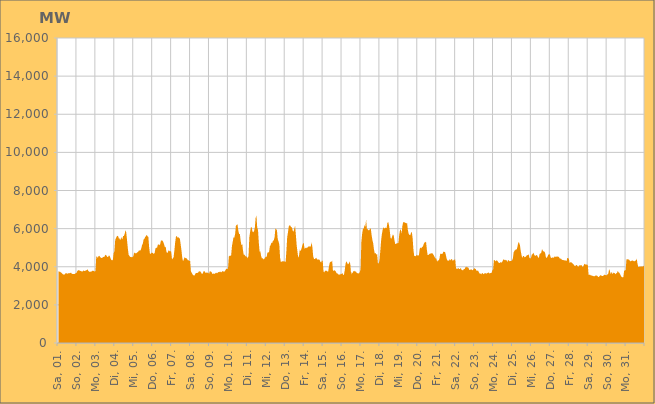
| Category | Series 0 |
|---|---|
|  Sa, 01.  | 3782.002 |
|  Sa, 01.  | 3737.937 |
|  Sa, 01.  | 3747.862 |
|  Sa, 01.  | 3707.015 |
|  Sa, 01.  | 3675.339 |
|  Sa, 01.  | 3641 |
|  Sa, 01.  | 3598.636 |
|  Sa, 01.  | 3596.49 |
|  Sa, 01.  | 3598.095 |
|  Sa, 01.  | 3652.015 |
|  Sa, 01.  | 3672.705 |
|  Sa, 01.  | 3621.643 |
|  Sa, 01.  | 3664.609 |
|  Sa, 01.  | 3659.359 |
|  Sa, 01.  | 3661.514 |
|  Sa, 01.  | 3672.214 |
|  Sa, 01.  | 3689.21 |
|  So, 02.  | 3633.749 |
|  So, 02.  | 3615.38 |
|  So, 02.  | 3622.406 |
|  So, 02.  | 3617.272 |
|  So, 02.  | 3628.931 |
|  So, 02.  | 3666.061 |
|  So, 02.  | 3671.611 |
|  So, 02.  | 3781.174 |
|  So, 02.  | 3814.514 |
|  So, 02.  | 3818.328 |
|  So, 02.  | 3800.51 |
|  So, 02.  | 3779.89 |
|  So, 02.  | 3763.114 |
|  So, 02.  | 3752.59 |
|  So, 02.  | 3763.972 |
|  So, 02.  | 3812.8 |
|  So, 02.  | 3767.855 |
|  So, 02.  | 3792.08 |
|  So, 02.  | 3807.779 |
|  So, 02.  | 3821.758 |
|  So, 02.  | 3868.054 |
|  So, 02.  | 3775.255 |
|  So, 02.  | 3751.963 |
|  So, 02.  | 3718.9 |
|  Mo, 03.  | 3756.618 |
|  Mo, 03.  | 3752.046 |
|  Mo, 03.  | 3786.243 |
|  Mo, 03.  | 3795.351 |
|  Mo, 03.  | 3771.194 |
|  Mo, 03.  | 3748.571 |
|  Mo, 03.  | 3783.521 |
|  Mo, 03.  | 4536.566 |
|  Mo, 03.  | 4526.029 |
|  Mo, 03.  | 4464.249 |
|  Mo, 03.  | 4565.328 |
|  Mo, 03.  | 4572.466 |
|  Mo, 03.  | 4505.5 |
|  Mo, 03.  | 4469.048 |
|  Mo, 03.  | 4453.125 |
|  Mo, 03.  | 4485.286 |
|  Mo, 03.  | 4524.361 |
|  Mo, 03.  | 4504.729 |
|  Mo, 03.  | 4586.432 |
|  Mo, 03.  | 4631.263 |
|  Mo, 03.  | 4581.992 |
|  Mo, 03.  | 4516.867 |
|  Mo, 03.  | 4516.41 |
|  Mo, 03.  | 4585.917 |
|  Di, 04.  | 4573.185 |
|  Di, 04.  | 4452.407 |
|  Di, 04.  | 4360.591 |
|  Di, 04.  | 4332.591 |
|  Di, 04.  | 4357.516 |
|  Di, 04.  | 4705.307 |
|  Di, 04.  | 4811.66 |
|  Di, 04.  | 5400.556 |
|  Di, 04.  | 5505.17 |
|  Di, 04.  | 5593.89 |
|  Di, 04.  | 5627.192 |
|  Di, 04.  | 5574.746 |
|  Di, 04.  | 5430.741 |
|  Di, 04.  | 5517.696 |
|  Di, 04.  | 5394.053 |
|  Di, 04.  | 5569.911 |
|  Di, 04.  | 5418.776 |
|  Di, 04.  | 5608.878 |
|  Di, 04.  | 5618.066 |
|  Di, 04.  | 5717.975 |
|  Di, 04.  | 5915.155 |
|  Di, 04.  | 5804.004 |
|  Di, 04.  | 5392.953 |
|  Di, 04.  | 4965.932 |
|  Mi, 05.  | 4627.926 |
|  Mi, 05.  | 4579.606 |
|  Mi, 05.  | 4498.724 |
|  Mi, 05.  | 4529.513 |
|  Mi, 05.  | 4492.445 |
|  Mi, 05.  | 4512.98 |
|  Mi, 05.  | 4554.381 |
|  Mi, 05.  | 4743.717 |
|  Mi, 05.  | 4711.019 |
|  Mi, 05.  | 4707.628 |
|  Mi, 05.  | 4708.21 |
|  Mi, 05.  | 4757.462 |
|  Mi, 05.  | 4778.803 |
|  Mi, 05.  | 4849.703 |
|  Mi, 05.  | 4853.038 |
|  Mi, 05.  | 4857.728 |
|  Mi, 05.  | 4955.215 |
|  Mi, 05.  | 5129.652 |
|  Mi, 05.  | 5219.118 |
|  Mi, 05.  | 5430.209 |
|  Mi, 05.  | 5468.647 |
|  Mi, 05.  | 5561.348 |
|  Mi, 05.  | 5606.072 |
|  Mi, 05.  | 5678.895 |
|  Do, 06.  | 5591.899 |
|  Do, 06.  | 5571.277 |
|  Do, 06.  | 5035.214 |
|  Do, 06.  | 4689.11 |
|  Do, 06.  | 4686.462 |
|  Do, 06.  | 4738.549 |
|  Do, 06.  | 4733.354 |
|  Do, 06.  | 4711.485 |
|  Do, 06.  | 4671.442 |
|  Do, 06.  | 4726.99 |
|  Do, 06.  | 4963.716 |
|  Do, 06.  | 4996.677 |
|  Do, 06.  | 4990.269 |
|  Do, 06.  | 5148.677 |
|  Do, 06.  | 5175.778 |
|  Do, 06.  | 5133.891 |
|  Do, 06.  | 5180.656 |
|  Do, 06.  | 5385.416 |
|  Do, 06.  | 5373.939 |
|  Do, 06.  | 5367.901 |
|  Do, 06.  | 5295.567 |
|  Do, 06.  | 5166.72 |
|  Do, 06.  | 5032.67 |
|  Do, 06.  | 5047.381 |
|  Fr, 07.  | 4773.019 |
|  Fr, 07.  | 4712.063 |
|  Fr, 07.  | 4790.84 |
|  Fr, 07.  | 4870.715 |
|  Fr, 07.  | 4806.021 |
|  Fr, 07.  | 4824.302 |
|  Fr, 07.  | 4776.832 |
|  Fr, 07.  | 4384.258 |
|  Fr, 07.  | 4440.236 |
|  Fr, 07.  | 4493.506 |
|  Fr, 07.  | 4851.806 |
|  Fr, 07.  | 5270.431 |
|  Fr, 07.  | 5573.264 |
|  Fr, 07.  | 5620.718 |
|  Fr, 07.  | 5523.539 |
|  Fr, 07.  | 5553.817 |
|  Fr, 07.  | 5504.785 |
|  Fr, 07.  | 5471.97 |
|  Fr, 07.  | 5170.54 |
|  Fr, 07.  | 4859.053 |
|  Fr, 07.  | 4465.393 |
|  Fr, 07.  | 4290.003 |
|  Fr, 07.  | 4393.885 |
|  Fr, 07.  | 4502.364 |
|  Sa, 08.  | 4453.157 |
|  Sa, 08.  | 4450.577 |
|  Sa, 08.  | 4426.308 |
|  Sa, 08.  | 4344.243 |
|  Sa, 08.  | 4346.778 |
|  Sa, 08.  | 4306.241 |
|  Sa, 08.  | 4302.773 |
|  Sa, 08.  | 3745.438 |
|  Sa, 08.  | 3685.118 |
|  Sa, 08.  | 3597.875 |
|  Sa, 08.  | 3563.397 |
|  Sa, 08.  | 3525.364 |
|  Sa, 08.  | 3577.997 |
|  Sa, 08.  | 3657.624 |
|  Sa, 08.  | 3678.878 |
|  Sa, 08.  | 3674.114 |
|  Sa, 08.  | 3689.371 |
|  Sa, 08.  | 3747.44 |
|  Sa, 08.  | 3761.906 |
|  Sa, 08.  | 3744.677 |
|  Sa, 08.  | 3695.959 |
|  Sa, 08.  | 3609.359 |
|  Sa, 08.  | 3657.762 |
|  Sa, 08.  | 3762.525 |
|  So, 09.  | 3782.242 |
|  So, 09.  | 3704.077 |
|  So, 09.  | 3674.979 |
|  So, 09.  | 3697.031 |
|  So, 09.  | 3686.918 |
|  So, 09.  | 3683.702 |
|  So, 09.  | 3623.076 |
|  So, 09.  | 3776.44 |
|  So, 09.  | 3747.538 |
|  So, 09.  | 3728.238 |
|  So, 09.  | 3638.538 |
|  So, 09.  | 3617.501 |
|  So, 09.  | 3658.413 |
|  So, 09.  | 3615.746 |
|  So, 09.  | 3659.238 |
|  So, 09.  | 3691.62 |
|  So, 09.  | 3649.033 |
|  So, 09.  | 3697.066 |
|  So, 09.  | 3719.458 |
|  So, 09.  | 3716.969 |
|  So, 09.  | 3756.187 |
|  So, 09.  | 3709.144 |
|  So, 09.  | 3722.371 |
|  So, 09.  | 3774.507 |
|  Mo, 10.  | 3756.208 |
|  Mo, 10.  | 3735.423 |
|  Mo, 10.  | 3767.448 |
|  Mo, 10.  | 3843.861 |
|  Mo, 10.  | 3899.959 |
|  Mo, 10.  | 3884.961 |
|  Mo, 10.  | 3895.92 |
|  Mo, 10.  | 4530.569 |
|  Mo, 10.  | 4581.591 |
|  Mo, 10.  | 4571.974 |
|  Mo, 10.  | 4609.064 |
|  Mo, 10.  | 5094.474 |
|  Mo, 10.  | 5321.23 |
|  Mo, 10.  | 5554.166 |
|  Mo, 10.  | 5520.664 |
|  Mo, 10.  | 5728.416 |
|  Mo, 10.  | 6151.398 |
|  Mo, 10.  | 6191.912 |
|  Mo, 10.  | 6230.986 |
|  Mo, 10.  | 5905.755 |
|  Mo, 10.  | 5725.145 |
|  Mo, 10.  | 5712.182 |
|  Mo, 10.  | 5363.663 |
|  Mo, 10.  | 5125.811 |
|  Di, 11.  | 5206.798 |
|  Di, 11.  | 4840.213 |
|  Di, 11.  | 4620.516 |
|  Di, 11.  | 4630.933 |
|  Di, 11.  | 4557.37 |
|  Di, 11.  | 4521.27 |
|  Di, 11.  | 4539.363 |
|  Di, 11.  | 4435.715 |
|  Di, 11.  | 4583.82 |
|  Di, 11.  | 5534.581 |
|  Di, 11.  | 5834.461 |
|  Di, 11.  | 6064.9 |
|  Di, 11.  | 6073.823 |
|  Di, 11.  | 5843.797 |
|  Di, 11.  | 5809.963 |
|  Di, 11.  | 5878.3 |
|  Di, 11.  | 6051.386 |
|  Di, 11.  | 6559.709 |
|  Di, 11.  | 6686.046 |
|  Di, 11.  | 6055.619 |
|  Di, 11.  | 5939.889 |
|  Di, 11.  | 5273.543 |
|  Di, 11.  | 4798.165 |
|  Di, 11.  | 4807.233 |
|  Mi, 12.  | 4550.74 |
|  Mi, 12.  | 4439.635 |
|  Mi, 12.  | 4442.729 |
|  Mi, 12.  | 4384.568 |
|  Mi, 12.  | 4416.689 |
|  Mi, 12.  | 4490.583 |
|  Mi, 12.  | 4524.045 |
|  Mi, 12.  | 4524.139 |
|  Mi, 12.  | 4749.835 |
|  Mi, 12.  | 4748.935 |
|  Mi, 12.  | 4774.115 |
|  Mi, 12.  | 5069.244 |
|  Mi, 12.  | 5135.284 |
|  Mi, 12.  | 5265.431 |
|  Mi, 12.  | 5241.344 |
|  Mi, 12.  | 5363.464 |
|  Mi, 12.  | 5383.742 |
|  Mi, 12.  | 5542.879 |
|  Mi, 12.  | 6001.75 |
|  Mi, 12.  | 5975.249 |
|  Mi, 12.  | 5915.383 |
|  Mi, 12.  | 5448.655 |
|  Mi, 12.  | 5329.567 |
|  Mi, 12.  | 5161.801 |
|  Do, 13.  | 4471.377 |
|  Do, 13.  | 4244.974 |
|  Do, 13.  | 4273.962 |
|  Do, 13.  | 4284.32 |
|  Do, 13.  | 4295.82 |
|  Do, 13.  | 4267.213 |
|  Do, 13.  | 4284.693 |
|  Do, 13.  | 4250.313 |
|  Do, 13.  | 4830.858 |
|  Do, 13.  | 5559.259 |
|  Do, 13.  | 5807.819 |
|  Do, 13.  | 6120.847 |
|  Do, 13.  | 6175.66 |
|  Do, 13.  | 6156.869 |
|  Do, 13.  | 6077.879 |
|  Do, 13.  | 6061.495 |
|  Do, 13.  | 5889.787 |
|  Do, 13.  | 5843.228 |
|  Do, 13.  | 6003.171 |
|  Do, 13.  | 6148.768 |
|  Do, 13.  | 5668.821 |
|  Do, 13.  | 5135.559 |
|  Do, 13.  | 4789.068 |
|  Do, 13.  | 4462.977 |
|  Fr, 14.  | 4591.733 |
|  Fr, 14.  | 4906.895 |
|  Fr, 14.  | 4819.857 |
|  Fr, 14.  | 4930.315 |
|  Fr, 14.  | 5091.798 |
|  Fr, 14.  | 5221.706 |
|  Fr, 14.  | 5247.978 |
|  Fr, 14.  | 4933.91 |
|  Fr, 14.  | 4987.883 |
|  Fr, 14.  | 5003.414 |
|  Fr, 14.  | 4974.671 |
|  Fr, 14.  | 5029.234 |
|  Fr, 14.  | 5060.499 |
|  Fr, 14.  | 5087.214 |
|  Fr, 14.  | 5030.51 |
|  Fr, 14.  | 5099.25 |
|  Fr, 14.  | 5277.189 |
|  Fr, 14.  | 4996.694 |
|  Fr, 14.  | 4526.425 |
|  Fr, 14.  | 4410.79 |
|  Fr, 14.  | 4403.916 |
|  Fr, 14.  | 4445.947 |
|  Fr, 14.  | 4467.241 |
|  Fr, 14.  | 4371.32 |
|  Sa, 15.  | 4387.02 |
|  Sa, 15.  | 4380.634 |
|  Sa, 15.  | 4368.473 |
|  Sa, 15.  | 4258.187 |
|  Sa, 15.  | 4225.911 |
|  Sa, 15.  | 4315.122 |
|  Sa, 15.  | 4320.72 |
|  Sa, 15.  | 3759.534 |
|  Sa, 15.  | 3693.635 |
|  Sa, 15.  | 3794.999 |
|  Sa, 15.  | 3789.053 |
|  Sa, 15.  | 3783.518 |
|  Sa, 15.  | 3754.896 |
|  Sa, 15.  | 3754.696 |
|  Sa, 15.  | 4033.065 |
|  Sa, 15.  | 4220.3 |
|  Sa, 15.  | 4259.462 |
|  Sa, 15.  | 4265.743 |
|  Sa, 15.  | 4316.249 |
|  Sa, 15.  | 3782.499 |
|  Sa, 15.  | 3798.252 |
|  Sa, 15.  | 3816.22 |
|  Sa, 15.  | 3786.111 |
|  Sa, 15.  | 3713.833 |
|  So, 16.  | 3647.351 |
|  So, 16.  | 3643.33 |
|  So, 16.  | 3584.568 |
|  So, 16.  | 3601.479 |
|  So, 16.  | 3580.291 |
|  So, 16.  | 3637.028 |
|  So, 16.  | 3619.224 |
|  So, 16.  | 3669.428 |
|  So, 16.  | 3561.367 |
|  So, 16.  | 3595.524 |
|  So, 16.  | 3830.84 |
|  So, 16.  | 4160.053 |
|  So, 16.  | 4293.068 |
|  So, 16.  | 4201.467 |
|  So, 16.  | 4124.008 |
|  So, 16.  | 4164.067 |
|  So, 16.  | 4278.24 |
|  So, 16.  | 4134.161 |
|  So, 16.  | 3604.174 |
|  So, 16.  | 3720.301 |
|  So, 16.  | 3653.085 |
|  So, 16.  | 3773.188 |
|  So, 16.  | 3786.903 |
|  So, 16.  | 3736.284 |
|  Mo, 17.  | 3764.475 |
|  Mo, 17.  | 3690.552 |
|  Mo, 17.  | 3652.552 |
|  Mo, 17.  | 3659.61 |
|  Mo, 17.  | 3641.865 |
|  Mo, 17.  | 3722.825 |
|  Mo, 17.  | 3861.384 |
|  Mo, 17.  | 5300.041 |
|  Mo, 17.  | 5727.302 |
|  Mo, 17.  | 5989.631 |
|  Mo, 17.  | 6003.145 |
|  Mo, 17.  | 6194.18 |
|  Mo, 17.  | 6090.25 |
|  Mo, 17.  | 6471.119 |
|  Mo, 17.  | 5995.623 |
|  Mo, 17.  | 5967.788 |
|  Mo, 17.  | 5909.048 |
|  Mo, 17.  | 5914.666 |
|  Mo, 17.  | 6007.623 |
|  Mo, 17.  | 5994.38 |
|  Mo, 17.  | 5657.608 |
|  Mo, 17.  | 5407.48 |
|  Mo, 17.  | 5225.869 |
|  Mo, 17.  | 4897.307 |
|  Di, 18.  | 4689.899 |
|  Di, 18.  | 4721.422 |
|  Di, 18.  | 4646.735 |
|  Di, 18.  | 4650.728 |
|  Di, 18.  | 4183.509 |
|  Di, 18.  | 4174.728 |
|  Di, 18.  | 4351.911 |
|  Di, 18.  | 4819.303 |
|  Di, 18.  | 5364 |
|  Di, 18.  | 5707.033 |
|  Di, 18.  | 5938.626 |
|  Di, 18.  | 6081.942 |
|  Di, 18.  | 5999.444 |
|  Di, 18.  | 6048.782 |
|  Di, 18.  | 6041.465 |
|  Di, 18.  | 6035.42 |
|  Di, 18.  | 6296.759 |
|  Di, 18.  | 6356.25 |
|  Di, 18.  | 6174.907 |
|  Di, 18.  | 5888.083 |
|  Di, 18.  | 5507.658 |
|  Di, 18.  | 5467.761 |
|  Di, 18.  | 5588.492 |
|  Di, 18.  | 5691.756 |
|  Mi, 19.  | 5640.686 |
|  Mi, 19.  | 5369.781 |
|  Mi, 19.  | 5189.21 |
|  Mi, 19.  | 5190.74 |
|  Mi, 19.  | 5247.133 |
|  Mi, 19.  | 5232.52 |
|  Mi, 19.  | 5255.392 |
|  Mi, 19.  | 5686.295 |
|  Mi, 19.  | 5912.893 |
|  Mi, 19.  | 5970.136 |
|  Mi, 19.  | 5737.211 |
|  Mi, 19.  | 6137.818 |
|  Mi, 19.  | 6337.751 |
|  Mi, 19.  | 6343.058 |
|  Mi, 19.  | 6319.014 |
|  Mi, 19.  | 6300.08 |
|  Mi, 19.  | 6277.142 |
|  Mi, 19.  | 6281.907 |
|  Mi, 19.  | 5913.698 |
|  Mi, 19.  | 5727.136 |
|  Mi, 19.  | 5666.21 |
|  Mi, 19.  | 5654.081 |
|  Mi, 19.  | 5788.389 |
|  Mi, 19.  | 5811.794 |
|  Do, 20.  | 5488.023 |
|  Do, 20.  | 4881.818 |
|  Do, 20.  | 4563.838 |
|  Do, 20.  | 4560.867 |
|  Do, 20.  | 4549.791 |
|  Do, 20.  | 4631.193 |
|  Do, 20.  | 4596.628 |
|  Do, 20.  | 4577.236 |
|  Do, 20.  | 4619.194 |
|  Do, 20.  | 4952.027 |
|  Do, 20.  | 5008.362 |
|  Do, 20.  | 4965 |
|  Do, 20.  | 5052.723 |
|  Do, 20.  | 5049.573 |
|  Do, 20.  | 5190.539 |
|  Do, 20.  | 5276.901 |
|  Do, 20.  | 5284.653 |
|  Do, 20.  | 5316.274 |
|  Do, 20.  | 4903.125 |
|  Do, 20.  | 4616.568 |
|  Do, 20.  | 4618.631 |
|  Do, 20.  | 4667.427 |
|  Do, 20.  | 4687.576 |
|  Do, 20.  | 4690.86 |
|  Fr, 21.  | 4710.766 |
|  Fr, 21.  | 4709.48 |
|  Fr, 21.  | 4651.354 |
|  Fr, 21.  | 4583.533 |
|  Fr, 21.  | 4495.541 |
|  Fr, 21.  | 4431.379 |
|  Fr, 21.  | 4427.343 |
|  Fr, 21.  | 4271.429 |
|  Fr, 21.  | 4326.833 |
|  Fr, 21.  | 4335.358 |
|  Fr, 21.  | 4425.355 |
|  Fr, 21.  | 4683.109 |
|  Fr, 21.  | 4689.565 |
|  Fr, 21.  | 4669.111 |
|  Fr, 21.  | 4686.94 |
|  Fr, 21.  | 4797.622 |
|  Fr, 21.  | 4770.248 |
|  Fr, 21.  | 4785.187 |
|  Fr, 21.  | 4633.425 |
|  Fr, 21.  | 4435.375 |
|  Fr, 21.  | 4331.415 |
|  Fr, 21.  | 4334.902 |
|  Fr, 21.  | 4301.3 |
|  Fr, 21.  | 4403.474 |
|  Sa, 22.  | 4325.176 |
|  Sa, 22.  | 4407.791 |
|  Sa, 22.  | 4386.724 |
|  Sa, 22.  | 4302.127 |
|  Sa, 22.  | 4362.679 |
|  Sa, 22.  | 4372.608 |
|  Sa, 22.  | 4377.788 |
|  Sa, 22.  | 3878.171 |
|  Sa, 22.  | 3921.125 |
|  Sa, 22.  | 3887.265 |
|  Sa, 22.  | 3932.658 |
|  Sa, 22.  | 3875.363 |
|  Sa, 22.  | 3886.217 |
|  Sa, 22.  | 3938.493 |
|  Sa, 22.  | 3838.302 |
|  Sa, 22.  | 3820.176 |
|  Sa, 22.  | 3815.71 |
|  Sa, 22.  | 3887.271 |
|  Sa, 22.  | 3883.179 |
|  Sa, 22.  | 3977.184 |
|  Sa, 22.  | 4002.626 |
|  Sa, 22.  | 3952.446 |
|  Sa, 22.  | 3989.065 |
|  Sa, 22.  | 3917.073 |
|  So, 23.  | 3824.211 |
|  So, 23.  | 3829.994 |
|  So, 23.  | 3870.128 |
|  So, 23.  | 3842.996 |
|  So, 23.  | 3812.914 |
|  So, 23.  | 3863.222 |
|  So, 23.  | 3924.182 |
|  So, 23.  | 3900.478 |
|  So, 23.  | 3876.156 |
|  So, 23.  | 3786.162 |
|  So, 23.  | 3796.794 |
|  So, 23.  | 3794.439 |
|  So, 23.  | 3700.378 |
|  So, 23.  | 3640.053 |
|  So, 23.  | 3643.777 |
|  So, 23.  | 3604.623 |
|  So, 23.  | 3675.236 |
|  So, 23.  | 3649.818 |
|  So, 23.  | 3609.124 |
|  So, 23.  | 3655.304 |
|  So, 23.  | 3658.075 |
|  So, 23.  | 3652.719 |
|  So, 23.  | 3639.896 |
|  So, 23.  | 3675.717 |
|  Mo, 24.  | 3711.622 |
|  Mo, 24.  | 3641.627 |
|  Mo, 24.  | 3670.076 |
|  Mo, 24.  | 3663.12 |
|  Mo, 24.  | 3679.552 |
|  Mo, 24.  | 3812.821 |
|  Mo, 24.  | 3863.773 |
|  Mo, 24.  | 4361.587 |
|  Mo, 24.  | 4343.864 |
|  Mo, 24.  | 4283.958 |
|  Mo, 24.  | 4330.408 |
|  Mo, 24.  | 4326.748 |
|  Mo, 24.  | 4276.457 |
|  Mo, 24.  | 4211.893 |
|  Mo, 24.  | 4192.883 |
|  Mo, 24.  | 4233.163 |
|  Mo, 24.  | 4236.603 |
|  Mo, 24.  | 4211.703 |
|  Mo, 24.  | 4298.569 |
|  Mo, 24.  | 4394.204 |
|  Mo, 24.  | 4344.222 |
|  Mo, 24.  | 4376.706 |
|  Mo, 24.  | 4338.961 |
|  Mo, 24.  | 4354.315 |
|  Di, 25.  | 4244.757 |
|  Di, 25.  | 4356.956 |
|  Di, 25.  | 4323.194 |
|  Di, 25.  | 4287.752 |
|  Di, 25.  | 4307.285 |
|  Di, 25.  | 4307.179 |
|  Di, 25.  | 4329.32 |
|  Di, 25.  | 4428.07 |
|  Di, 25.  | 4744.791 |
|  Di, 25.  | 4839.084 |
|  Di, 25.  | 4865.699 |
|  Di, 25.  | 4922.821 |
|  Di, 25.  | 4902.748 |
|  Di, 25.  | 5088.292 |
|  Di, 25.  | 5285.43 |
|  Di, 25.  | 5258.631 |
|  Di, 25.  | 5130.129 |
|  Di, 25.  | 4825.989 |
|  Di, 25.  | 4604.767 |
|  Di, 25.  | 4459.989 |
|  Di, 25.  | 4559.736 |
|  Di, 25.  | 4560.004 |
|  Di, 25.  | 4490.746 |
|  Di, 25.  | 4521.262 |
|  Mi, 26.  | 4555.978 |
|  Mi, 26.  | 4623.412 |
|  Mi, 26.  | 4596.158 |
|  Mi, 26.  | 4658.63 |
|  Mi, 26.  | 4470.176 |
|  Mi, 26.  | 4433.101 |
|  Mi, 26.  | 4464.648 |
|  Mi, 26.  | 4632.844 |
|  Mi, 26.  | 4658.901 |
|  Mi, 26.  | 4738.86 |
|  Mi, 26.  | 4635.293 |
|  Mi, 26.  | 4572.922 |
|  Mi, 26.  | 4576.67 |
|  Mi, 26.  | 4623.695 |
|  Mi, 26.  | 4581.341 |
|  Mi, 26.  | 4493.258 |
|  Mi, 26.  | 4468.868 |
|  Mi, 26.  | 4678.754 |
|  Mi, 26.  | 4692.848 |
|  Mi, 26.  | 4734.987 |
|  Mi, 26.  | 4926.295 |
|  Mi, 26.  | 4842.376 |
|  Mi, 26.  | 4796.399 |
|  Mi, 26.  | 4792.328 |
|  Do, 27.  | 4707.587 |
|  Do, 27.  | 4482.046 |
|  Do, 27.  | 4465.883 |
|  Do, 27.  | 4545.21 |
|  Do, 27.  | 4639.687 |
|  Do, 27.  | 4650.466 |
|  Do, 27.  | 4647.29 |
|  Do, 27.  | 4485.492 |
|  Do, 27.  | 4459.016 |
|  Do, 27.  | 4490.543 |
|  Do, 27.  | 4489.029 |
|  Do, 27.  | 4472.658 |
|  Do, 27.  | 4544.34 |
|  Do, 27.  | 4519.567 |
|  Do, 27.  | 4518.374 |
|  Do, 27.  | 4548.572 |
|  Do, 27.  | 4518.784 |
|  Do, 27.  | 4532.454 |
|  Do, 27.  | 4464.935 |
|  Do, 27.  | 4409.944 |
|  Do, 27.  | 4440.599 |
|  Do, 27.  | 4361.769 |
|  Do, 27.  | 4359.554 |
|  Do, 27.  | 4352.353 |
|  Fr, 28.  | 4327.524 |
|  Fr, 28.  | 4341.93 |
|  Fr, 28.  | 4327.794 |
|  Fr, 28.  | 4291.144 |
|  Fr, 28.  | 4460.561 |
|  Fr, 28.  | 4449.599 |
|  Fr, 28.  | 4419.738 |
|  Fr, 28.  | 4187.634 |
|  Fr, 28.  | 4242.892 |
|  Fr, 28.  | 4236.387 |
|  Fr, 28.  | 4198.137 |
|  Fr, 28.  | 4161.023 |
|  Fr, 28.  | 4118.971 |
|  Fr, 28.  | 4064.457 |
|  Fr, 28.  | 4029.272 |
|  Fr, 28.  | 4084.008 |
|  Fr, 28.  | 4090.455 |
|  Fr, 28.  | 4034.878 |
|  Fr, 28.  | 3985.77 |
|  Fr, 28.  | 4075.945 |
|  Fr, 28.  | 4069.112 |
|  Fr, 28.  | 4075.909 |
|  Fr, 28.  | 4088.765 |
|  Fr, 28.  | 4004.411 |
|  Sa, 29.  | 3998.163 |
|  Sa, 29.  | 4093.578 |
|  Sa, 29.  | 4162.807 |
|  Sa, 29.  | 4111.534 |
|  Sa, 29.  | 4118.129 |
|  Sa, 29.  | 4105.061 |
|  Sa, 29.  | 4101.956 |
|  Sa, 29.  | 3575.634 |
|  Sa, 29.  | 3583.096 |
|  Sa, 29.  | 3575.491 |
|  Sa, 29.  | 3539.091 |
|  Sa, 29.  | 3536.834 |
|  Sa, 29.  | 3523.219 |
|  Sa, 29.  | 3511.774 |
|  Sa, 29.  | 3495.849 |
|  Sa, 29.  | 3512.614 |
|  Sa, 29.  | 3544.942 |
|  Sa, 29.  | 3539.19 |
|  Sa, 29.  | 3518.301 |
|  Sa, 29.  | 3474.413 |
|  Sa, 29.  | 3457.023 |
|  Sa, 29.  | 3516.013 |
|  Sa, 29.  | 3561.927 |
|  Sa, 29.  | 3542.381 |
|  So, 30.  | 3506.914 |
|  So, 30.  | 3516.837 |
|  So, 30.  | 3543.821 |
|  So, 30.  | 3586.167 |
|  So, 30.  | 3568.63 |
|  So, 30.  | 3557.179 |
|  So, 30.  | 3559.632 |
|  So, 30.  | 3605.3 |
|  So, 30.  | 3638.111 |
|  So, 30.  | 3870.724 |
|  So, 30.  | 3783.746 |
|  So, 30.  | 3608.471 |
|  So, 30.  | 3738.466 |
|  So, 30.  | 3596.411 |
|  So, 30.  | 3704.268 |
|  So, 30.  | 3653.163 |
|  So, 30.  | 3675.243 |
|  So, 30.  | 3604.935 |
|  So, 30.  | 3661.267 |
|  So, 30.  | 3667.284 |
|  So, 30.  | 3792.771 |
|  So, 30.  | 3698.447 |
|  So, 30.  | 3686.632 |
|  So, 30.  | 3604.264 |
|  Mo, 31.  | 3517.097 |
|  Mo, 31.  | 3456.172 |
|  Mo, 31.  | 3453.295 |
|  Mo, 31.  | 3446.142 |
|  Mo, 31.  | 3772.966 |
|  Mo, 31.  | 3816.303 |
|  Mo, 31.  | 3825.397 |
|  Mo, 31.  | 4389.856 |
|  Mo, 31.  | 4408.477 |
|  Mo, 31.  | 4361.248 |
|  Mo, 31.  | 4392.58 |
|  Mo, 31.  | 4331.063 |
|  Mo, 31.  | 4289.008 |
|  Mo, 31.  | 4297.546 |
|  Mo, 31.  | 4325.098 |
|  Mo, 31.  | 4320.704 |
|  Mo, 31.  | 4300.157 |
|  Mo, 31.  | 4283.413 |
|  Mo, 31.  | 4310.529 |
|  Mo, 31.  | 4332.609 |
|  Mo, 31.  | 4425.312 |
|  Mo, 31.  | 4155.483 |
|  Mo, 31.  | 3981.778 |
|  Mo, 31.  | 3990.683 |
|  Di, 01.  | 4015.24 |
|  Di, 01.  | 4003.729 |
|  Di, 01.  | 4020.154 |
|  Di, 01.  | 4006.298 |
|  Di, 01.  | 4018.947 |
|  Di, 01.  | 4047.243 |